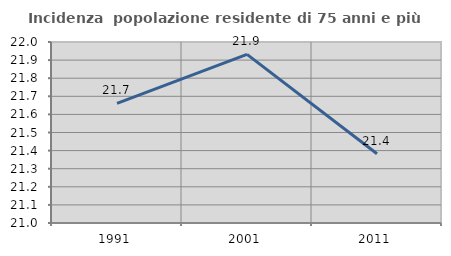
| Category | Incidenza  popolazione residente di 75 anni e più |
|---|---|
| 1991.0 | 21.661 |
| 2001.0 | 21.932 |
| 2011.0 | 21.382 |